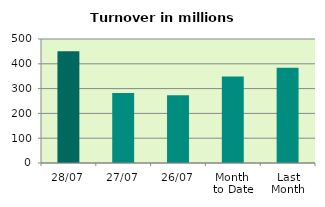
| Category | Series 0 |
|---|---|
| 28/07 | 450.514 |
| 27/07 | 282.353 |
| 26/07 | 273.495 |
| Month 
to Date | 348.875 |
| Last
Month | 384.158 |